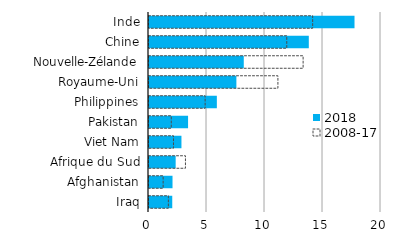
| Category | 2018 | 2008-17 |
|---|---|---|
| Inde | 17.716 | 14.108 |
| Chine | 13.776 | 11.877 |
| Nouvelle-Zélande | 8.169 | 13.285 |
| Royaume-Uni | 7.533 | 11.113 |
| Philippines | 5.849 | 4.839 |
| Pakistan | 3.368 | 1.919 |
| Viet Nam | 2.797 | 2.11 |
| Afrique du Sud | 2.298 | 3.142 |
| Afghanistan | 2.027 | 1.218 |
| Iraq | 2.005 | 1.668 |